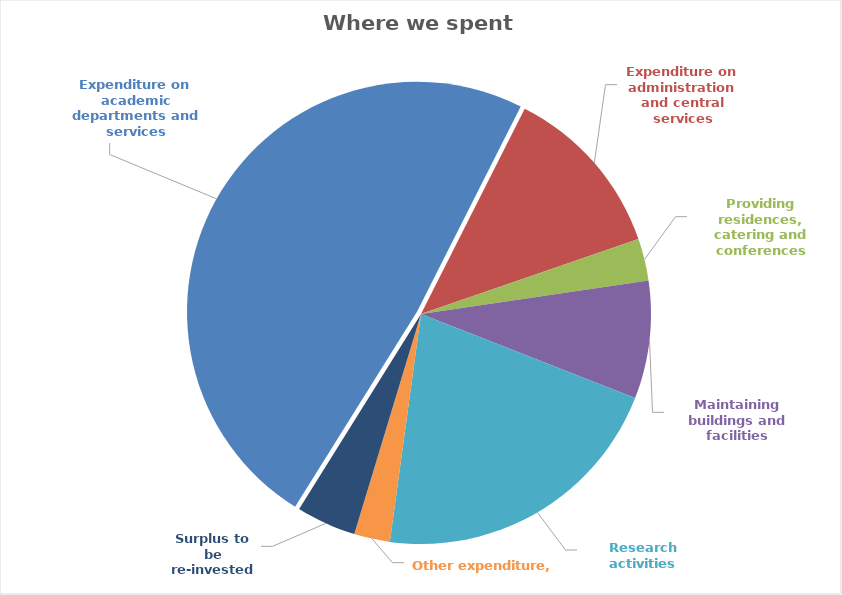
| Category | Series 0 |
|---|---|
| Expenditure on academic departments and services | 208850 |
| Expenditure on administration and central services | 52807 |
| Providing residences, catering and conferences | 12663 |
| Maintaining buildings and facilities | 35622 |
| Research activities | 91260 |
| Other expenditure | 10834 |
| Surplus to be re-invested | 18087 |